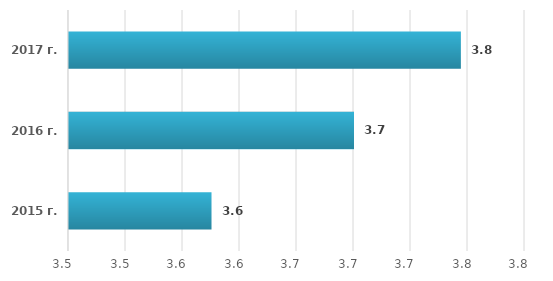
| Category | Series 0 |
|---|---|
| 2015 г. | 3.6 |
| 2016 г. | 3.7 |
| 2017 г. | 3.775 |